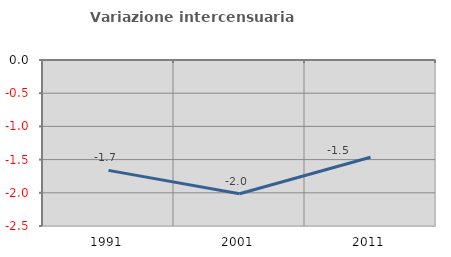
| Category | Variazione intercensuaria annua |
|---|---|
| 1991.0 | -1.663 |
| 2001.0 | -2.015 |
| 2011.0 | -1.464 |